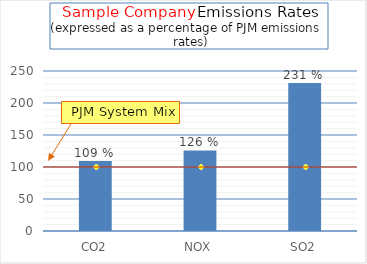
| Category | % of PJM Emissions |
|---|---|
| CO2 | 109.423 |
| NOX | 125.806 |
| SO2 | 231.081 |